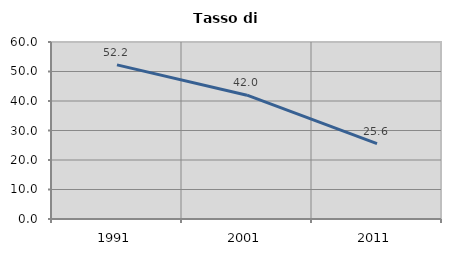
| Category | Tasso di disoccupazione   |
|---|---|
| 1991.0 | 52.246 |
| 2001.0 | 41.968 |
| 2011.0 | 25.57 |